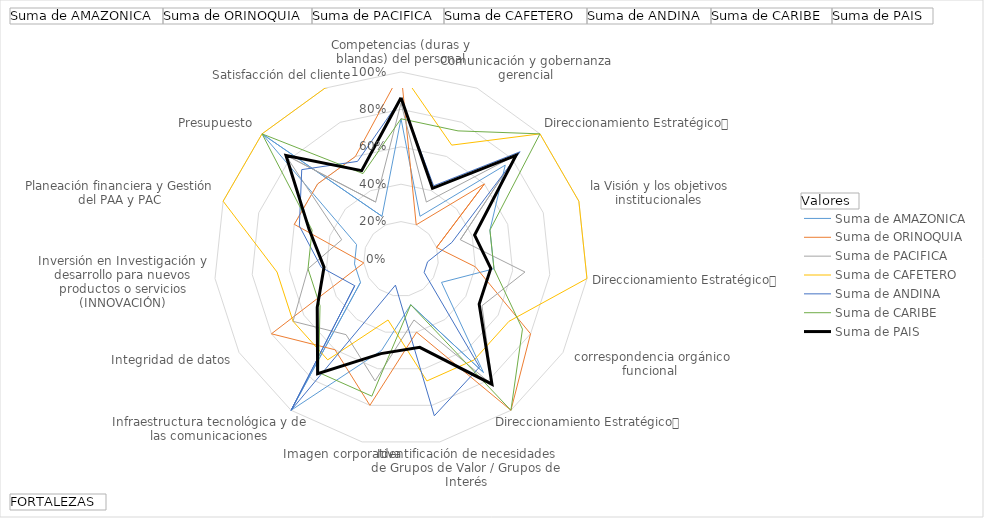
| Category | Suma de AMAZONICA | Suma de ORINOQUIA | Suma de PACIFICA | Suma de CAFETERO | Suma de ANDINA | Suma de CARIBE | Suma de PAIS |
|---|---|---|---|---|---|---|---|
| Competencias (duras y blandas) del personal | 0.75 | 1 | 0.833 | 1 | 0.857 | 0.75 | 0.862 |
| Comunicación y gobernanza gerencial | 0.25 | 0.2 | 0.333 | 0.667 | 0.429 | 0.75 | 0.414 |
| Direccionamiento Estratégico
Determinación y alcance de la Misión, la Visión y los objetivos institucionales | 0.75 | 0.6 | 0.833 | 1 | 0.857 | 1 | 0.828 |
| Direccionamiento Estratégico
Estructura y Orientación Organizacional, correspondencia orgánico funcional | 0.5 | 0.2 | 0.333 | 1 | 0.286 | 0.5 | 0.414 |
| Direccionamiento Estratégico
Sistemas de Control y evaluación de la gestión | 0.5 | 0.4 | 0.667 | 1 | 0.143 | 0.5 | 0.483 |
| Identificación de necesidades de Grupos de Valor / Grupos de Interés | 0.25 | 0.8 | 0.5 | 0.667 | 0.143 | 0.75 | 0.483 |
| Imagen corporativa | 0.75 | 1 | 0.833 | 0.667 | 0.714 | 1 | 0.828 |
| Infraestructura tecnológica y de las comunicaciones | 0.25 | 0.4 | 0.333 | 0.667 | 0.857 | 0.25 | 0.483 |
| Integridad de datos | 0.5 | 0.8 | 0.667 | 0.333 | 0.143 | 0.75 | 0.517 |
| Inversión en Investigación y desarrollo para nuevos productos o servicios (INNOVACIÓN) | 1 | 0.6 | 0.5 | 0.667 | 1 | 0.75 | 0.759 |
| Planeación financiera y Gestión del PAA y PAC | 0.25 | 0.8 | 0.667 | 0.667 | 0.286 | 0.5 | 0.517 |
| Presupuesto | 0.25 | 0.2 | 0.5 | 0.667 | 0.429 | 0.5 | 0.414 |
| Satisfacción del cliente | 0.25 | 0.6 | 0.333 | 1 | 0.571 | 0.5 | 0.517 |
| Sistemas de Gestión (SIGA; MIPG; MECI; SGSST; SGSI; SGA) | 1 | 0.6 | 0.833 | 1 | 0.714 | 1 | 0.828 |
| Trabajo en equipo | 0.25 | 0.6 | 0.333 | 1 | 0.571 | 0.5 | 0.517 |